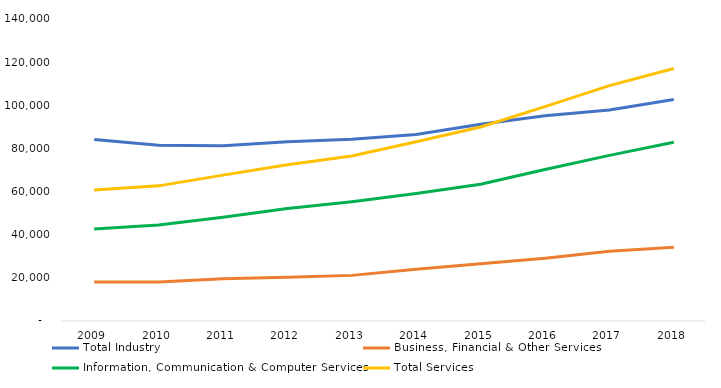
| Category | Total Industry | Business, Financial & Other Services | Information, Communication & Computer Services | Total Services |
|---|---|---|---|---|
| 2009.0 | 84087 | 18132 | 42625 | 60757 |
| 2010.0 | 81453 | 18132 | 44517 | 62649 |
| 2011.0 | 81186 | 19529 | 48086 | 67615 |
| 2012.0 | 83058 | 20284 | 52170 | 72454 |
| 2013.0 | 84307 | 21150 | 55329 | 76479 |
| 2014.0 | 86452 | 23939 | 59147 | 83086 |
| 2015.0 | 91228 | 26547 | 63370 | 89917 |
| 2016.0 | 95099 | 29104 | 70261 | 99365 |
| 2017.0 | 97858 | 32371 | 76765 | 109136 |
| 2018.0 | 102637 | 34140 | 82895 | 117035 |